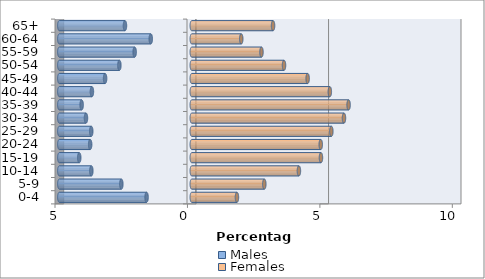
| Category | Males | Females |
|---|---|---|
| 0-4 | -1.706 | 1.705 |
| 5-9 | -2.659 | 2.739 |
| 10-14 | -3.792 | 4.044 |
| 15-19 | -4.249 | 4.877 |
| 20-24 | -3.837 | 4.869 |
| 25-29 | -3.795 | 5.269 |
| 30-34 | -3.995 | 5.746 |
| 35-39 | -4.158 | 5.921 |
| 40-44 | -3.771 | 5.212 |
| 45-49 | -3.273 | 4.374 |
| 50-54 | -2.734 | 3.482 |
| 55-59 | -2.157 | 2.631 |
| 60-64 | -1.548 | 1.868 |
| 65+ | -2.523 | 3.068 |